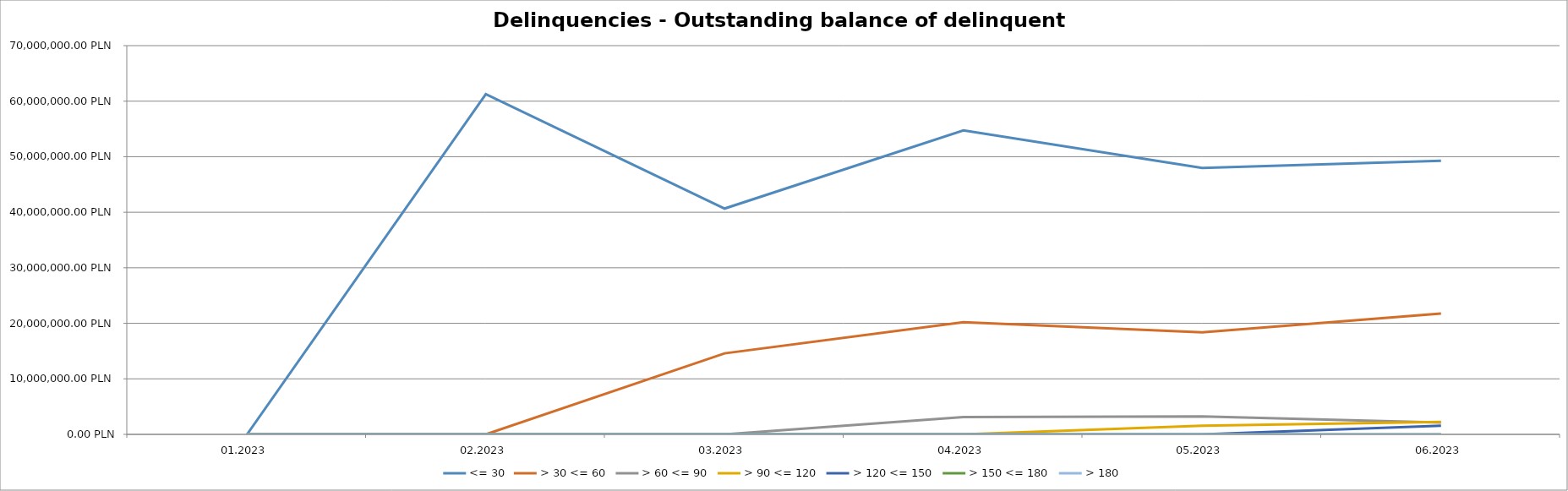
| Category | <= 30 | > 30 <= 60 | > 60 <= 90 | > 90 <= 120 | > 120 <= 150 | > 150 <= 180 | > 180 |
|---|---|---|---|---|---|---|---|
| 01.2023 | 0 | 0 | 0 | 0 | 0 | 0 | 0 |
| 02.2023 | 61279332.52 | 0 | 0 | 0 | 0 | 0 | 0 |
| 03.2023 | 40663789.15 | 14592814.21 | 0 | 0 | 0 | 0 | 0 |
| 04.2023 | 54729258.98 | 20207986.71 | 3105470.81 | 0 | 0 | 0 | 0 |
| 05.2023 | 47980491.52 | 18365026.23 | 3236930.39 | 1575049.71 | 0 | 0 | 0 |
| 06.2023 | 49274463.43 | 21757116.33 | 2145346.9 | 2234258.08 | 1546159.58 | 0 | 0 |